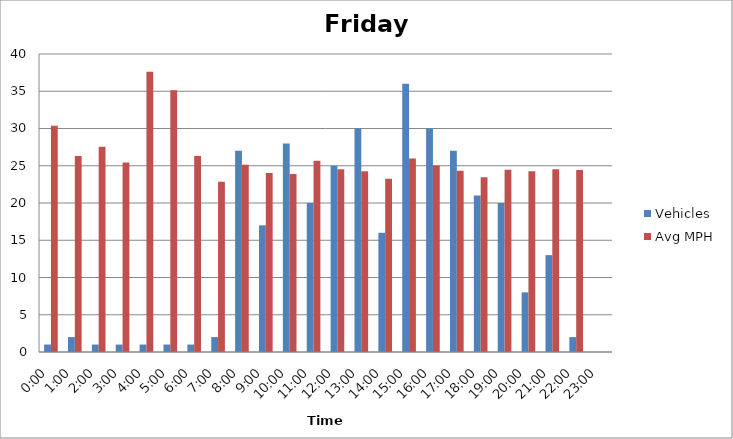
| Category | Vehicles | Avg MPH |
|---|---|---|
| 0:00 | 1 | 30.36 |
| 1:00 | 2 | 26.31 |
| 2:00 | 1 | 27.56 |
| 3:00 | 1 | 25.45 |
| 4:00 | 1 | 37.63 |
| 5:00 | 1 | 35.14 |
| 6:00 | 1 | 26.31 |
| 7:00 | 2 | 22.86 |
| 8:00 | 27 | 25.12 |
| 9:00 | 17 | 24.03 |
| 10:00 | 28 | 23.89 |
| 11:00 | 20 | 25.67 |
| 12:00 | 25 | 24.52 |
| 13:00 | 30 | 24.26 |
| 14:00 | 16 | 23.27 |
| 15:00 | 36 | 25.97 |
| 16:00 | 30 | 25.04 |
| 17:00 | 27 | 24.34 |
| 18:00 | 21 | 23.45 |
| 19:00 | 20 | 24.47 |
| 20:00 | 8 | 24.27 |
| 21:00 | 13 | 24.52 |
| 22:00 | 2 | 24.44 |
| 23:00 | 0 | 0 |